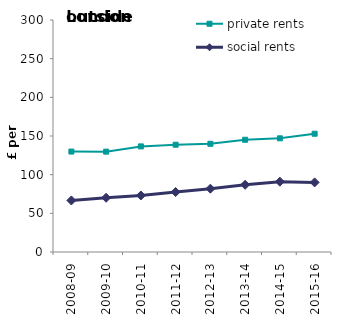
| Category | private rents | social rents |
|---|---|---|
| 2008-09 | 129.859 | 66.683 |
| 2009-10 | 129.768 | 70.138 |
| 2010-11 | 136.549 | 73.095 |
| 2011-12 | 138.693 | 77.549 |
| 2012-13 | 139.93 | 81.88 |
| 2013-14 | 145.142 | 86.912 |
| 2014-15 | 146.999 | 90.906 |
| 2015-16 | 152.934 | 90 |